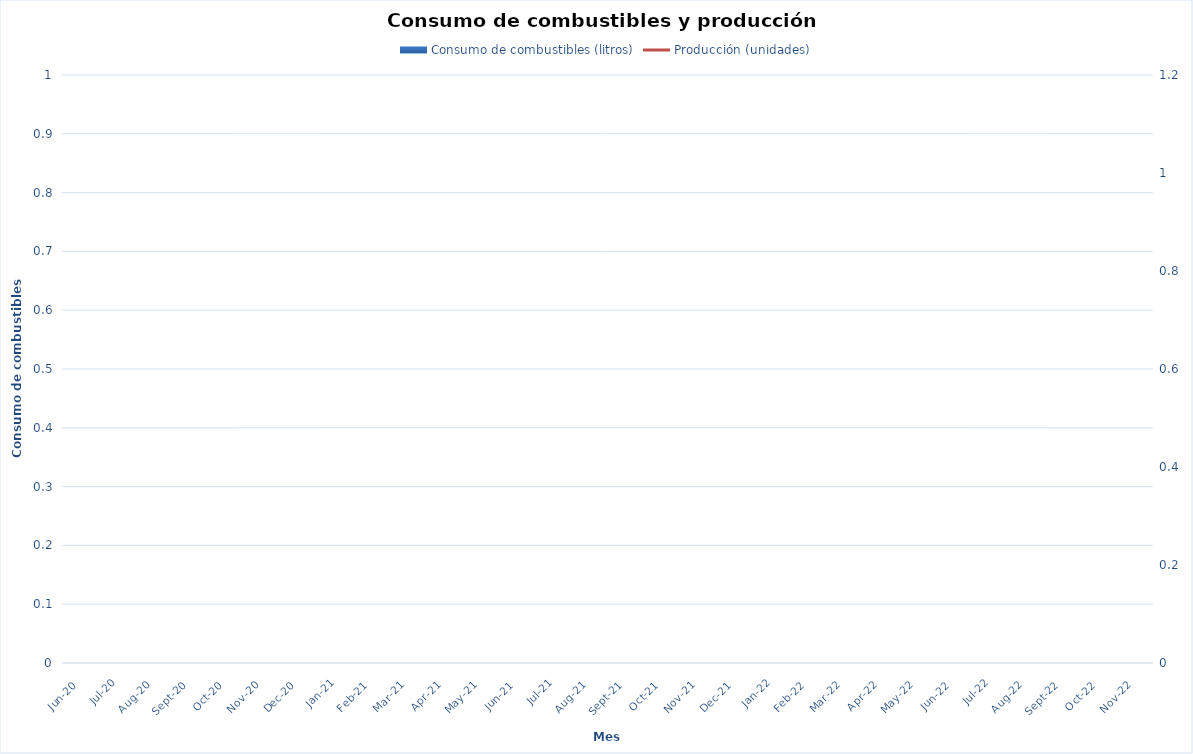
| Category | Consumo de combustibles (litros) |
|---|---|
| 2020-06-01 | 0 |
| 2020-07-01 | 0 |
| 2020-08-01 | 0 |
| 2020-09-01 | 0 |
| 2020-10-01 | 0 |
| 2020-11-01 | 0 |
| 2020-12-01 | 0 |
| 2021-01-01 | 0 |
| 2021-02-01 | 0 |
| 2021-03-01 | 0 |
| 2021-04-01 | 0 |
| 2021-05-01 | 0 |
| 2021-06-01 | 0 |
| 2021-07-01 | 0 |
| 2021-08-01 | 0 |
| 2021-09-01 | 0 |
| 2021-10-01 | 0 |
| 2021-11-01 | 0 |
| 2021-12-01 | 0 |
| 2022-01-01 | 0 |
| 2022-02-01 | 0 |
| 2022-03-01 | 0 |
| 2022-04-01 | 0 |
| 2022-05-01 | 0 |
| 2022-06-01 | 0 |
| 2022-07-01 | 0 |
| 2022-08-01 | 0 |
| 2022-09-01 | 0 |
| 2022-10-01 | 0 |
| 2022-11-01 | 0 |